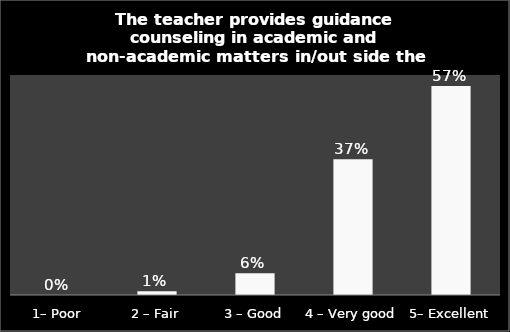
| Category | Series 0 |
|---|---|
| 1– Poor | 0 |
| 2 – Fair | 0.01 |
| 3 – Good | 0.059 |
| 4 – Very good | 0.37 |
| 5– Excellent | 0.57 |